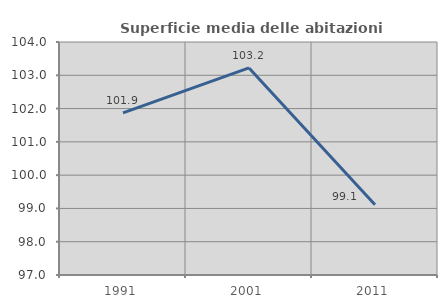
| Category | Superficie media delle abitazioni occupate |
|---|---|
| 1991.0 | 101.873 |
| 2001.0 | 103.221 |
| 2011.0 | 99.109 |